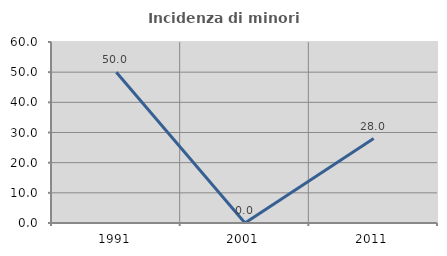
| Category | Incidenza di minori stranieri |
|---|---|
| 1991.0 | 50 |
| 2001.0 | 0 |
| 2011.0 | 28 |